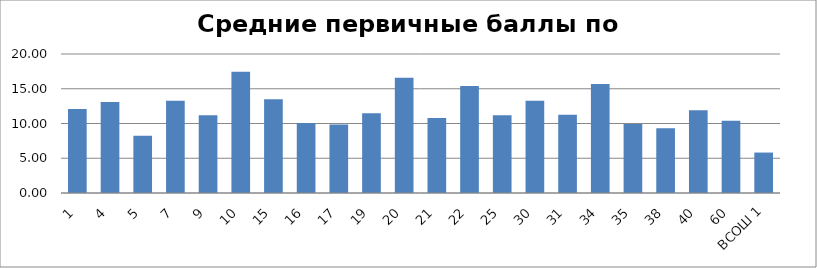
| Category | 1 4 5 7 9 10 15 16 17 19 20 21 22 25 30 31 34 35 38 40 60 ВСОШ 1 |
|---|---|
| 1 | 12.077 |
| 4 | 13.091 |
| 5 | 8.231 |
| 7 | 13.267 |
| 9 | 11.182 |
| 10 | 17.442 |
| 15 | 13.5 |
| 16 | 10.083 |
| 17 | 9.839 |
| 19 | 11.478 |
| 20 | 16.591 |
| 21 | 10.783 |
| 22 | 15.381 |
| 25 | 11.174 |
| 30 | 13.263 |
| 31 | 11.25 |
| 34 | 15.68 |
| 35 | 9.917 |
| 38 | 9.312 |
| 40 | 11.915 |
| 60 | 10.409 |
| ВСОШ 1 | 5.818 |